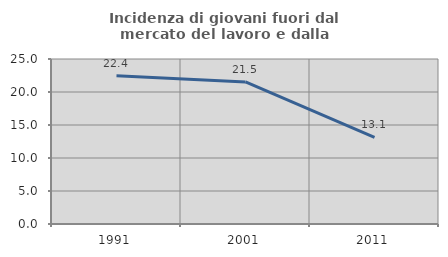
| Category | Incidenza di giovani fuori dal mercato del lavoro e dalla formazione  |
|---|---|
| 1991.0 | 22.449 |
| 2001.0 | 21.531 |
| 2011.0 | 13.122 |